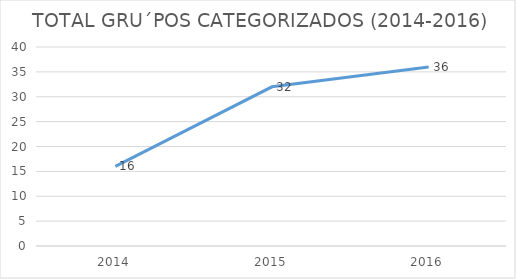
| Category | TOTAL |
|---|---|
| 2014.0 | 16 |
| 2015.0 | 32 |
| 2016.0 | 36 |